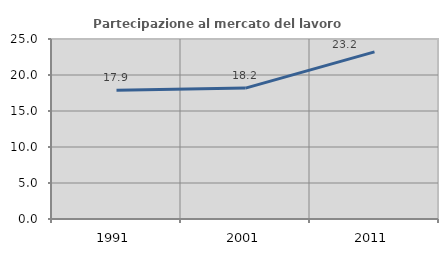
| Category | Partecipazione al mercato del lavoro  femminile |
|---|---|
| 1991.0 | 17.896 |
| 2001.0 | 18.182 |
| 2011.0 | 23.214 |